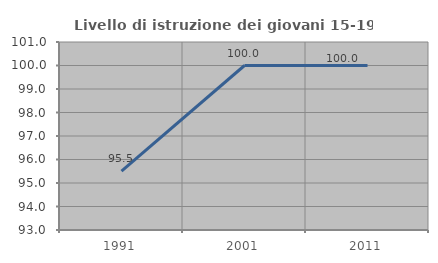
| Category | Livello di istruzione dei giovani 15-19 anni |
|---|---|
| 1991.0 | 95.506 |
| 2001.0 | 100 |
| 2011.0 | 100 |